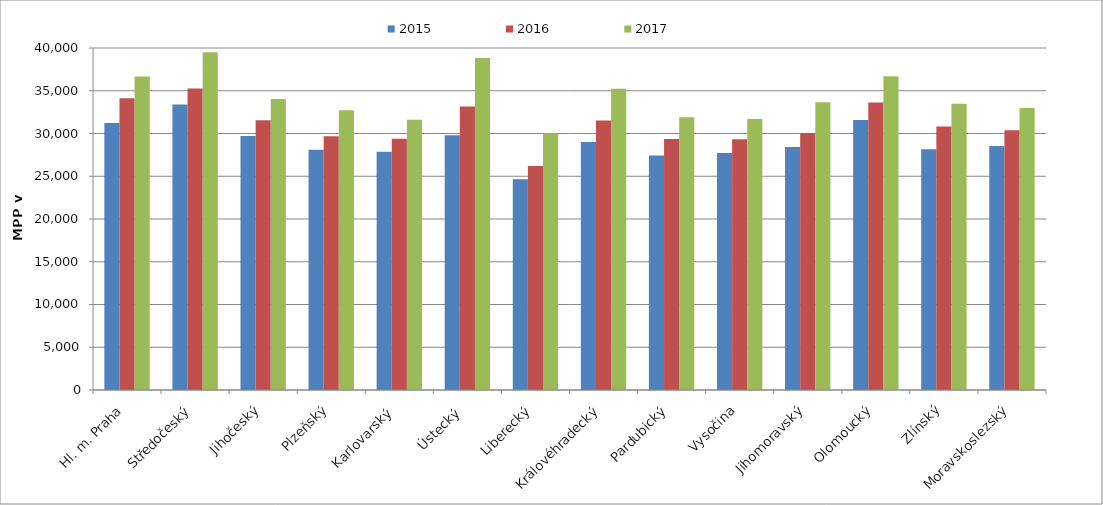
| Category | 2015 | 2016 | 2017 |
|---|---|---|---|
| Hl. m. Praha | 31233.359 | 34112.572 | 36666.288 |
| Středočeský | 33391.375 | 35266.526 | 39494.862 |
| Jihočeský | 29693.778 | 31558.743 | 34041.477 |
| Plzeňský | 28113.677 | 29690.941 | 32705.435 |
| Karlovarský  | 27853.211 | 29394.495 | 31596.33 |
| Ústecký   | 29794.286 | 33152.459 | 38843.035 |
| Liberecký | 24658.417 | 26206.457 | 30029.528 |
| Královéhradecký | 29004.022 | 31522.774 | 35236.043 |
| Pardubický | 27415.014 | 29361.714 | 31913.837 |
| Vysočina | 27708.205 | 29339.221 | 31686.655 |
| Jihomoravský | 28427.1 | 30056.369 | 33652.273 |
| Olomoucký | 31580.096 | 33628.708 | 36705.609 |
| Zlínský | 28161.071 | 30832.653 | 33475.981 |
| Moravskoslezský | 28552.174 | 30365.68 | 32992.516 |